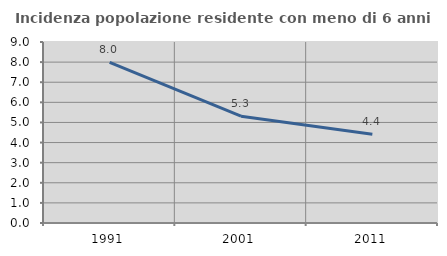
| Category | Incidenza popolazione residente con meno di 6 anni |
|---|---|
| 1991.0 | 7.985 |
| 2001.0 | 5.313 |
| 2011.0 | 4.413 |